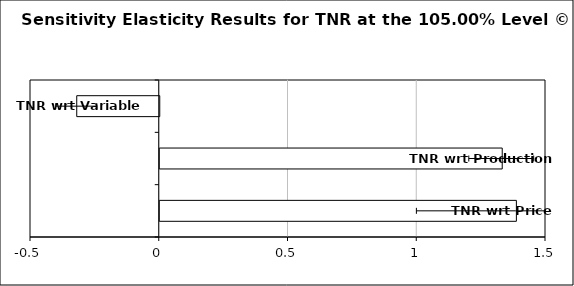
| Category | Series 0 |
|---|---|
| TNR wrt Price Means | 1.385 |
| TNR wrt Production Means | 1.33 |
| TNR wrt Variable Costs | -0.32 |